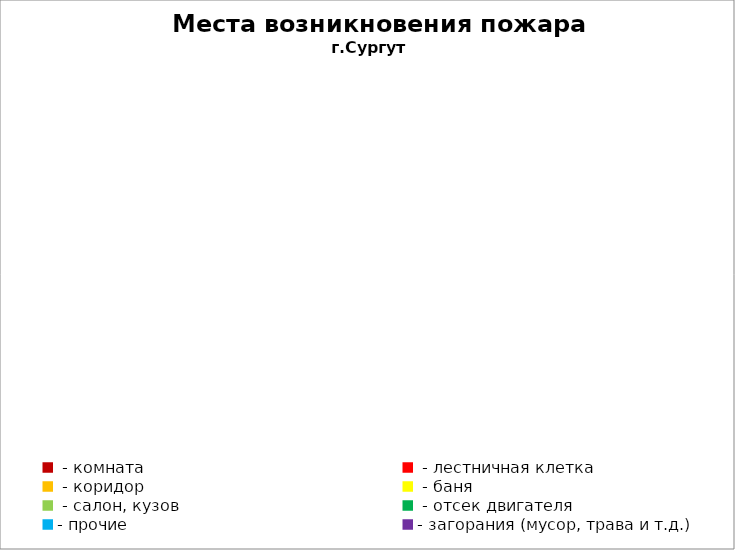
| Category | Места возникновения пожара |
|---|---|
|  - комната | 49 |
|  - лестничная клетка | 21 |
|  - коридор | 9 |
|  - баня | 23 |
|  - салон, кузов | 10 |
|  - отсек двигателя | 27 |
| - прочие | 105 |
| - загорания (мусор, трава и т.д.)  | 160 |